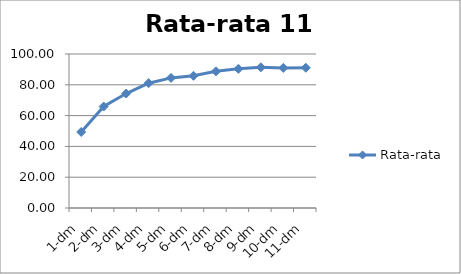
| Category | Rata-rata |
|---|---|
| 1-dm | 49.362 |
| 2-dm | 65.878 |
| 3-dm | 74.32 |
| 4-dm | 81.056 |
| 5-dm | 84.471 |
| 6-dm | 85.837 |
| 7-dm | 88.766 |
| 8-dm | 90.368 |
| 9-dm | 91.366 |
| 10-dm | 90.972 |
| 11-dm | 91.071 |